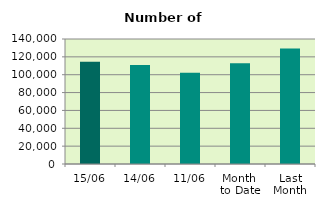
| Category | Series 0 |
|---|---|
| 15/06 | 114626 |
| 14/06 | 110822 |
| 11/06 | 102072 |
| Month 
to Date | 112936.545 |
| Last
Month | 129378.19 |